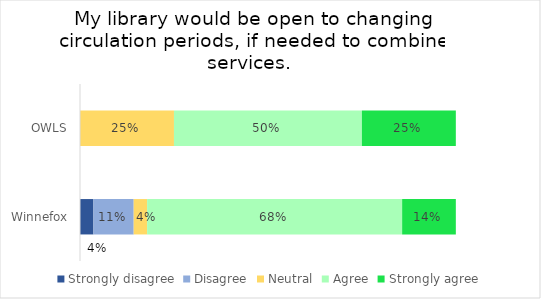
| Category | Strongly disagree | Disagree | Neutral | Agree | Strongly agree |
|---|---|---|---|---|---|
| OWLS | 0 | 0 | 0.25 | 0.5 | 0.25 |
| Winnefox | 0.036 | 0.107 | 0.036 | 0.679 | 0.143 |